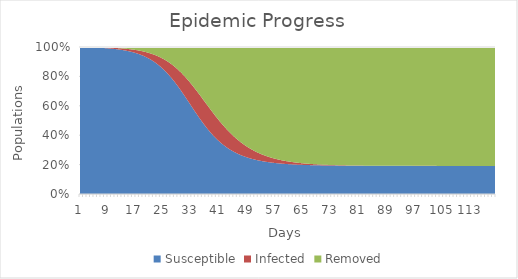
| Category | Susceptible | Infected | Removed |
|---|---|---|---|
| 0 | 9986.004 | 11.996 | 2 |
| 1 | 9981.212 | 14.388 | 4.399 |
| 2 | 9975.468 | 17.255 | 7.277 |
| 3 | 9968.583 | 20.69 | 10.728 |
| 4 | 9960.333 | 24.801 | 14.866 |
| 5 | 9950.452 | 29.722 | 19.826 |
| 6 | 9938.621 | 35.608 | 25.771 |
| 7 | 9924.466 | 42.642 | 32.892 |
| 8 | 9907.538 | 51.042 | 41.421 |
| 9 | 9887.31 | 61.061 | 51.629 |
| 10 | 9863.161 | 72.998 | 63.841 |
| 11 | 9834.361 | 87.198 | 78.441 |
| 12 | 9800.059 | 104.06 | 95.88 |
| 13 | 9759.268 | 124.04 | 116.692 |
| 14 | 9710.846 | 147.654 | 141.5 |
| 15 | 9653.492 | 175.476 | 171.031 |
| 16 | 9585.734 | 208.14 | 206.126 |
| 17 | 9505.927 | 246.319 | 247.754 |
| 18 | 9412.268 | 290.714 | 297.018 |
| 19 | 9302.816 | 342.023 | 355.161 |
| 20 | 9175.545 | 400.889 | 423.565 |
| 21 | 9028.41 | 467.846 | 503.743 |
| 22 | 8859.454 | 543.233 | 597.313 |
| 23 | 8666.944 | 627.097 | 705.959 |
| 24 | 8449.544 | 719.078 | 831.379 |
| 25 | 8206.508 | 818.297 | 975.194 |
| 26 | 7937.894 | 923.253 | 1138.854 |
| 27 | 7644.747 | 1031.749 | 1323.504 |
| 28 | 7329.248 | 1140.898 | 1529.854 |
| 29 | 6994.771 | 1247.195 | 1758.033 |
| 30 | 6645.817 | 1346.71 | 2007.473 |
| 31 | 6287.818 | 1435.368 | 2276.815 |
| 32 | 5926.805 | 1509.307 | 2563.888 |
| 33 | 5568.99 | 1565.261 | 2865.749 |
| 34 | 5220.313 | 1600.885 | 3178.802 |
| 35 | 4886.028 | 1614.993 | 3498.979 |
| 36 | 4570.392 | 1607.631 | 3821.977 |
| 37 | 4276.492 | 1580.005 | 4143.503 |
| 38 | 4006.217 | 1534.279 | 4459.504 |
| 39 | 3760.351 | 1473.289 | 4766.36 |
| 40 | 3538.748 | 1400.235 | 5061.018 |
| 41 | 3340.544 | 1318.391 | 5341.065 |
| 42 | 3164.379 | 1230.878 | 5604.743 |
| 43 | 3008.58 | 1140.501 | 5850.919 |
| 44 | 2871.329 | 1049.653 | 6079.019 |
| 45 | 2750.773 | 960.278 | 6288.949 |
| 46 | 2645.112 | 873.883 | 6481.005 |
| 47 | 2552.652 | 791.567 | 6655.781 |
| 48 | 2471.828 | 714.077 | 6814.095 |
| 49 | 2401.225 | 641.865 | 6956.91 |
| 50 | 2339.574 | 575.142 | 7085.283 |
| 51 | 2285.751 | 513.937 | 7200.312 |
| 52 | 2238.762 | 458.139 | 7303.099 |
| 53 | 2197.735 | 407.538 | 7394.727 |
| 54 | 2161.909 | 361.857 | 7476.235 |
| 55 | 2130.616 | 320.777 | 7548.606 |
| 56 | 2103.278 | 283.96 | 7612.762 |
| 57 | 2079.388 | 251.058 | 7669.554 |
| 58 | 2058.507 | 221.728 | 7719.765 |
| 59 | 2040.249 | 195.64 | 7764.111 |
| 60 | 2024.283 | 172.478 | 7803.239 |
| 61 | 2010.317 | 151.948 | 7837.734 |
| 62 | 1998.099 | 133.777 | 7868.124 |
| 63 | 1987.407 | 117.714 | 7894.879 |
| 64 | 1978.049 | 103.529 | 7918.422 |
| 65 | 1969.858 | 91.014 | 7939.128 |
| 66 | 1962.686 | 79.983 | 7957.331 |
| 67 | 1956.407 | 70.266 | 7973.327 |
| 68 | 1950.908 | 61.711 | 7987.38 |
| 69 | 1946.093 | 54.185 | 7999.723 |
| 70 | 1941.875 | 47.566 | 8010.56 |
| 71 | 1938.18 | 41.747 | 8020.073 |
| 72 | 1934.943 | 36.634 | 8028.422 |
| 73 | 1932.108 | 32.143 | 8035.749 |
| 74 | 1929.624 | 28.198 | 8042.178 |
| 75 | 1927.447 | 24.735 | 8047.817 |
| 76 | 1925.54 | 21.695 | 8052.764 |
| 77 | 1923.869 | 19.027 | 8057.103 |
| 78 | 1922.405 | 16.686 | 8060.909 |
| 79 | 1921.122 | 14.632 | 8064.246 |
| 80 | 1919.998 | 12.83 | 8067.172 |
| 81 | 1919.012 | 11.249 | 8069.738 |
| 82 | 1918.149 | 9.863 | 8071.988 |
| 83 | 1917.392 | 8.647 | 8073.961 |
| 84 | 1916.729 | 7.581 | 8075.69 |
| 85 | 1916.148 | 6.646 | 8077.206 |
| 86 | 1915.638 | 5.826 | 8078.536 |
| 87 | 1915.192 | 5.107 | 8079.701 |
| 88 | 1914.801 | 4.477 | 8080.722 |
| 89 | 1914.458 | 3.925 | 8081.618 |
| 90 | 1914.157 | 3.44 | 8082.403 |
| 91 | 1913.894 | 3.016 | 8083.091 |
| 92 | 1913.663 | 2.643 | 8083.694 |
| 93 | 1913.461 | 2.317 | 8084.222 |
| 94 | 1913.283 | 2.031 | 8084.686 |
| 95 | 1913.128 | 1.78 | 8085.092 |
| 96 | 1912.992 | 1.56 | 8085.448 |
| 97 | 1912.872 | 1.368 | 8085.76 |
| 98 | 1912.768 | 1.199 | 8086.034 |
| 99 | 1912.676 | 1.051 | 8086.273 |
| 100 | 1912.595 | 0.921 | 8086.484 |
| 101 | 1912.525 | 0.807 | 8086.668 |
| 102 | 1912.463 | 0.708 | 8086.829 |
| 103 | 1912.409 | 0.62 | 8086.971 |
| 104 | 1912.362 | 0.544 | 8087.095 |
| 105 | 1912.32 | 0.476 | 8087.203 |
| 106 | 1912.284 | 0.418 | 8087.299 |
| 107 | 1912.252 | 0.366 | 8087.382 |
| 108 | 1912.224 | 0.321 | 8087.456 |
| 109 | 1912.199 | 0.281 | 8087.52 |
| 110 | 1912.178 | 0.246 | 8087.576 |
| 111 | 1912.159 | 0.216 | 8087.625 |
| 112 | 1912.142 | 0.189 | 8087.668 |
| 113 | 1912.128 | 0.166 | 8087.706 |
| 114 | 1912.115 | 0.145 | 8087.739 |
| 115 | 1912.104 | 0.127 | 8087.769 |
| 116 | 1912.094 | 0.112 | 8087.794 |
| 117 | 1912.086 | 0.098 | 8087.816 |
| 118 | 1912.078 | 0.086 | 8087.836 |
| 119 | 1912.072 | 0.075 | 8087.853 |